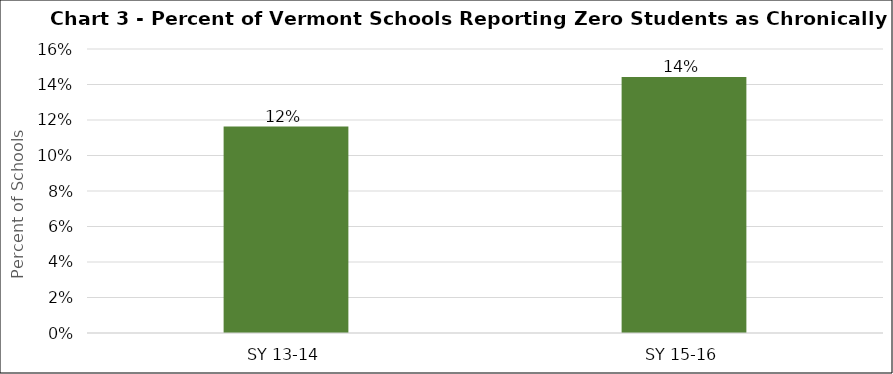
| Category | Series 0 |
|---|---|
| SY 13-14 | 0.116 |
| SY 15-16 | 0.144 |